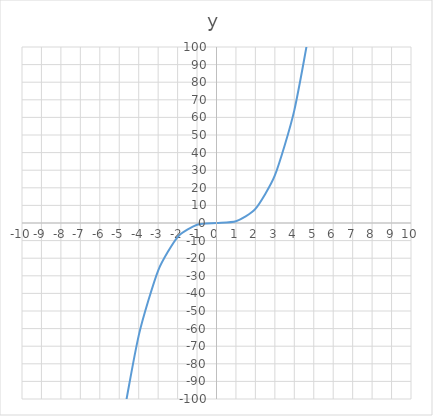
| Category | y |
|---|---|
| -10.0 | -1000 |
| -9.0 | -729 |
| -8.0 | -512 |
| -7.0 | -343 |
| -6.0 | -216 |
| -5.0 | -125 |
| -4.0 | -64 |
| -3.0 | -27 |
| -2.0 | -8 |
| -1.0 | -1 |
| 0.0 | 0 |
| 1.0 | 1 |
| 2.0 | 8 |
| 3.0 | 27 |
| 4.0 | 64 |
| 5.0 | 125 |
| 6.0 | 216 |
| 7.0 | 343 |
| 8.0 | 512 |
| 9.0 | 729 |
| 10.0 | 1000 |